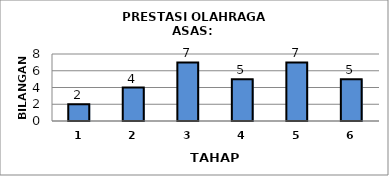
| Category | Series 0 |
|---|---|
| 1.0 | 2 |
| 2.0 | 4 |
| 3.0 | 7 |
| 4.0 | 5 |
| 5.0 | 7 |
| 6.0 | 5 |